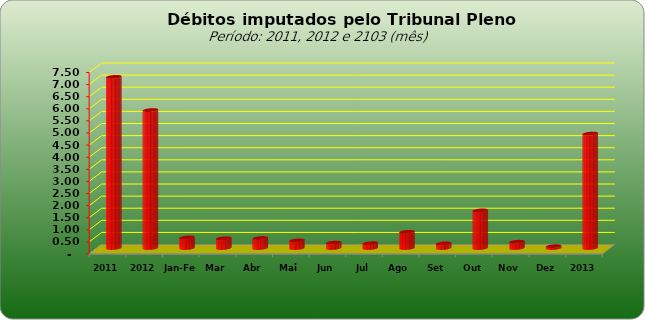
| Category |  7.073.154,74   5.698.720,25   436.112,79   401.482,76   413.229,26   313.253,71   220.510,24   197.835,92   670.047,46   189.705,54   1.552.892,31   258.515,72   73.447,80   4.727.033,51  |
|---|---|
| 2011 | 7073154.74 |
| 2012 | 5698720.25 |
| Jan-Fev | 436112.79 |
| Mar | 401482.76 |
| Abr | 413229.26 |
| Mai | 313253.71 |
| Jun | 220510.24 |
| Jul | 197835.92 |
| Ago | 670047.46 |
| Set | 189705.54 |
| Out | 1552892.31 |
| Nov | 258515.72 |
| Dez | 73447.8 |
| 2013 | 4727033.51 |